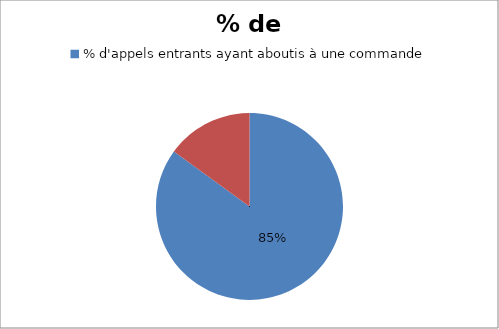
| Category | Series 0 |
|---|---|
| % d'appels entrants ayant aboutis à une commande | 85 |
| % d'appels sortants ayant aboutis à une commande | 15 |